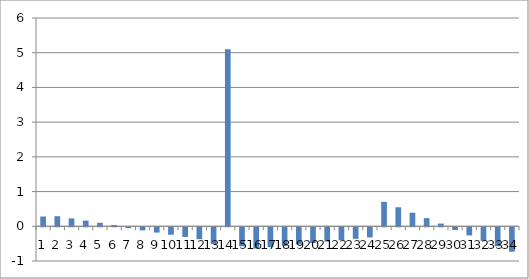
| Category | Series 0 |
|---|---|
| 0 | 0.282 |
| 1 | 0.291 |
| 2 | 0.227 |
| 3 | 0.164 |
| 4 | 0.101 |
| 5 | 0.038 |
| 6 | -0.026 |
| 7 | -0.089 |
| 8 | -0.152 |
| 9 | -0.215 |
| 10 | -0.279 |
| 11 | -0.342 |
| 12 | -0.482 |
| 13 | 5.098 |
| 14 | -0.547 |
| 15 | -0.612 |
| 16 | -0.572 |
| 17 | -0.532 |
| 18 | -0.492 |
| 19 | -0.452 |
| 20 | -0.412 |
| 21 | -0.372 |
| 22 | -0.332 |
| 23 | -0.293 |
| 24 | 0.703 |
| 25 | 0.547 |
| 26 | 0.391 |
| 27 | 0.234 |
| 28 | 0.078 |
| 29 | -0.078 |
| 30 | -0.234 |
| 31 | -0.391 |
| 32 | -0.547 |
| 33 | -0.703 |